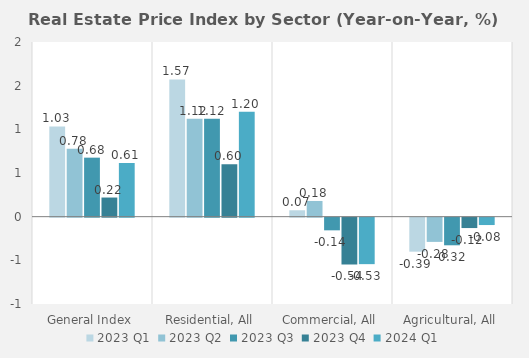
| Category | 2023 | 2024 |
|---|---|---|
| General Index | 0.219 | 0.615 |
| Residential, All | 0.599 | 1.202 |
| Commercial, All | -0.536 | -0.532 |
| Agricultural, All | -0.119 | -0.084 |